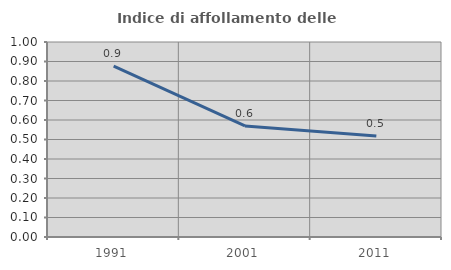
| Category | Indice di affollamento delle abitazioni  |
|---|---|
| 1991.0 | 0.876 |
| 2001.0 | 0.569 |
| 2011.0 | 0.518 |